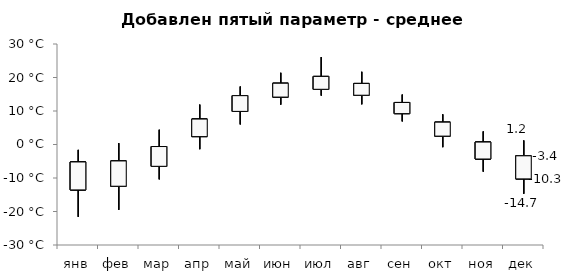
| Category | μ-σ | макс | мин | μ | μ+σ |
|---|---|---|---|---|---|
| янв | -13.557 | -1.6 | -21.6 | -9.388 | -5.219 |
| фев | -12.455 | 0.4 | -19.5 | -8.685 | -4.915 |
| мар | -6.507 | 4.4 | -10.4 | -3.557 | -0.608 |
| апр | 2.359 | 11.9 | -1.4 | 4.975 | 7.59 |
| май | 9.882 | 17.3 | 6 | 12.231 | 14.579 |
| июн | 14.16 | 21.4 | 11.9 | 16.224 | 18.287 |
| июл | 16.48 | 26.1 | 14.6 | 18.403 | 20.326 |
| авг | 14.707 | 21.7 | 12 | 16.466 | 18.225 |
| сен | 9.216 | 14.9 | 6.9 | 10.88 | 12.544 |
| окт | 2.503 | 9 | -0.8 | 4.583 | 6.663 |
| ноя | -4.327 | 3.9 | -8.1 | -1.801 | 0.725 |
| дек | -10.264 | 1.2 | -14.7 | -6.821 | -3.378 |